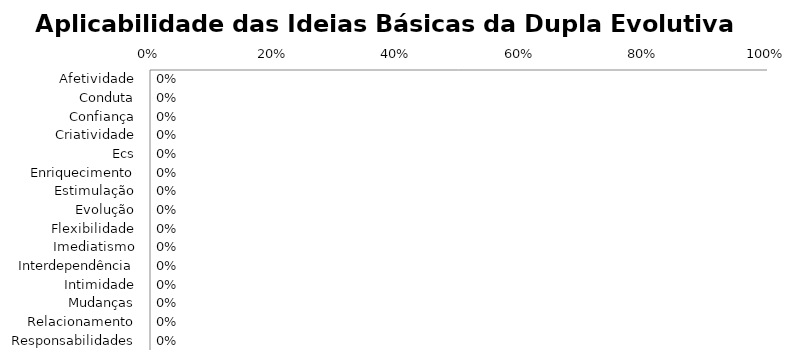
| Category | Series 0 |
|---|---|
| Afetividade | 0 |
| Conduta | 0 |
| Confiança | 0 |
| Criatividade | 0 |
| Ecs | 0 |
| Enriquecimento | 0 |
| Estimulação | 0 |
| Evolução | 0 |
| Flexibilidade | 0 |
| Imediatismo | 0 |
| Interdependência | 0 |
| Intimidade | 0 |
| Mudanças | 0 |
| Relacionamento | 0 |
| Responsabilidades | 0 |